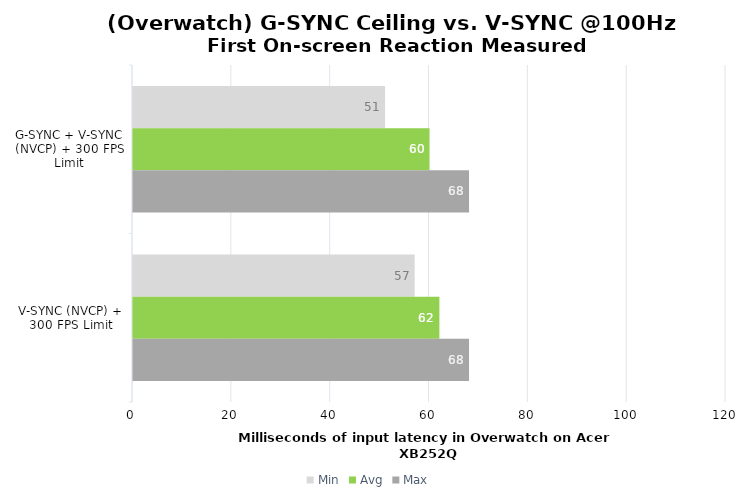
| Category | Min | Avg | Max |
|---|---|---|---|
| G-SYNC + V-SYNC (NVCP) + 300 FPS Limit | 51 | 60 | 68 |
| V-SYNC (NVCP) + 300 FPS Limit | 57 | 62 | 68 |